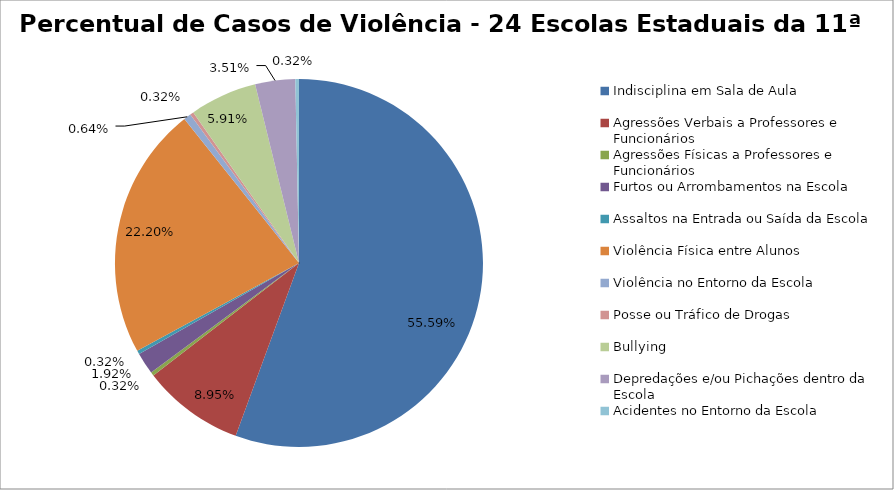
| Category | Percentual |
|---|---|
| Indisciplina em Sala de Aula | 0.556 |
| Agressões Verbais a Professores e Funcionários | 0.089 |
| Agressões Físicas a Professores e Funcionários | 0.003 |
| Furtos ou Arrombamentos na Escola | 0.019 |
| Assaltos na Entrada ou Saída da Escola | 0.003 |
| Violência Física entre Alunos | 0.222 |
| Violência no Entorno da Escola | 0.006 |
| Posse ou Tráfico de Drogas | 0.003 |
| Bullying | 0.059 |
| Depredações e/ou Pichações dentro da Escola | 0.035 |
| Acidentes no Entorno da Escola | 0.003 |